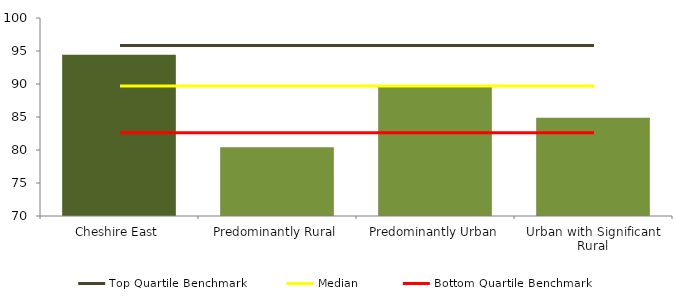
| Category | Series 0 |
|---|---|
| Cheshire East | 94.444 |
| Predominantly Rural | 80.432 |
| Predominantly Urban | 89.78 |
| Urban with Significant Rural | 84.897 |